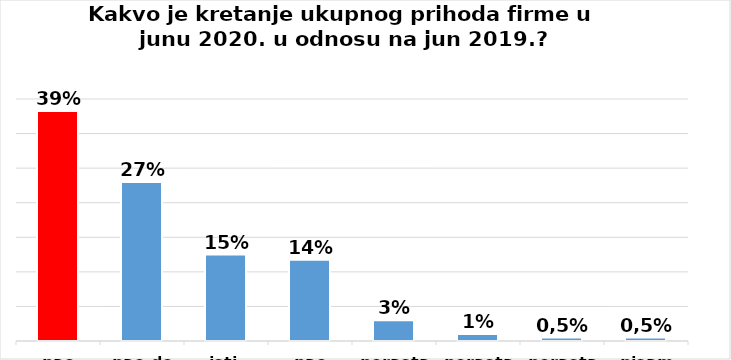
| Category | Series 0 |
|---|---|
| pao 20-50% | 133 |
| pao do 20% | 92 |
| isti | 50 |
| pao preko 50% | 47 |
| porastao do 20% | 12 |
| porastao 20-50% | 4 |
| porastao više od 50% | 2 |
| nisam siguran | 2 |